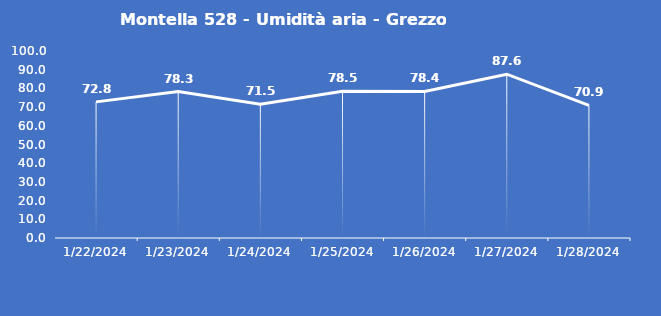
| Category | Montella 528 - Umidità aria - Grezzo (%) |
|---|---|
| 1/22/24 | 72.8 |
| 1/23/24 | 78.3 |
| 1/24/24 | 71.5 |
| 1/25/24 | 78.5 |
| 1/26/24 | 78.4 |
| 1/27/24 | 87.6 |
| 1/28/24 | 70.9 |